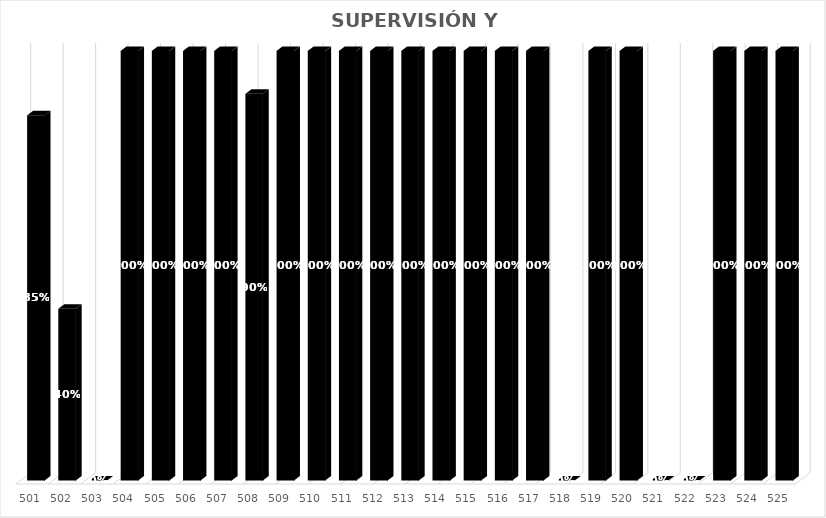
| Category | % Avance |
|---|---|
| 501.0 | 0.85 |
| 502.0 | 0.4 |
| 503.0 | 0 |
| 504.0 | 1 |
| 505.0 | 1 |
| 506.0 | 1 |
| 507.0 | 1 |
| 508.0 | 0.9 |
| 509.0 | 1 |
| 510.0 | 1 |
| 511.0 | 1 |
| 512.0 | 1 |
| 513.0 | 1 |
| 514.0 | 1 |
| 515.0 | 1 |
| 516.0 | 1 |
| 517.0 | 1 |
| 518.0 | 0 |
| 519.0 | 1 |
| 520.0 | 1 |
| 521.0 | 0 |
| 522.0 | 0 |
| 523.0 | 1 |
| 524.0 | 1 |
| 525.0 | 1 |